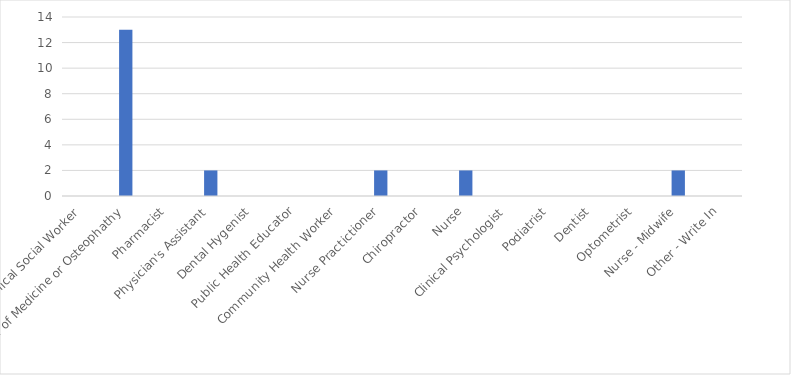
| Category | Number of Responses |
|---|---|
| Clinical Social Worker | 0 |
| Doctor of Medicine or Osteophathy | 13 |
| Pharmacist | 0 |
| Physician's Assistant | 2 |
| Dental Hygenist | 0 |
| Public Health Educator | 0 |
| Community Health Worker | 0 |
| Nurse Practictioner | 2 |
| Chiropractor | 0 |
| Nurse | 2 |
| Clinical Psychologist | 0 |
| Podiatrist | 0 |
| Dentist | 0 |
| Optometrist | 0 |
| Nurse - Midwife | 2 |
| Other - Write In | 0 |